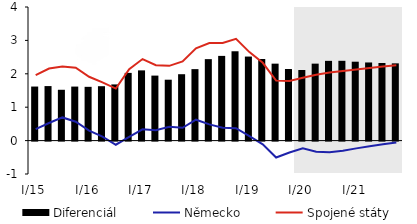
| Category | Diferenciál |
|---|---|
| 0 | 1.618 |
| 1 | 1.632 |
| 2 | 1.522 |
| 3 | 1.617 |
| 4 | 1.61 |
| 5 | 1.629 |
| 6 | 1.682 |
| 7 | 2.027 |
| 8 | 2.102 |
| 9 | 1.946 |
| 10 | 1.823 |
| 11 | 1.988 |
| 12 | 2.14 |
| 13 | 2.439 |
| 14 | 2.536 |
| 15 | 2.675 |
| 16 | 2.516 |
| 17 | 2.442 |
| 18 | 2.304 |
| 19 | 2.143 |
| 20 | 2.113 |
| 21 | 2.304 |
| 22 | 2.388 |
| 23 | 2.389 |
| 24 | 2.362 |
| 25 | 2.339 |
| 26 | 2.323 |
| 27 | 2.313 |